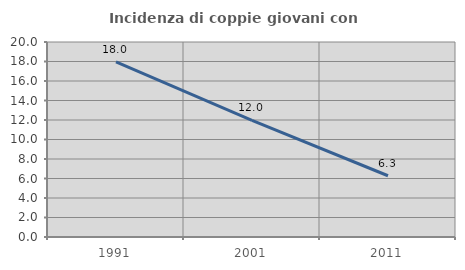
| Category | Incidenza di coppie giovani con figli |
|---|---|
| 1991.0 | 17.954 |
| 2001.0 | 11.963 |
| 2011.0 | 6.283 |